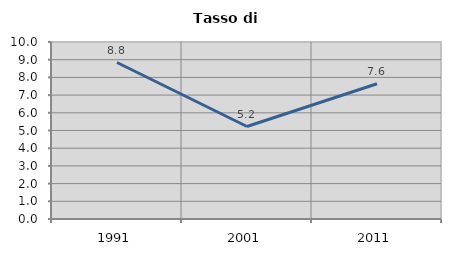
| Category | Tasso di disoccupazione   |
|---|---|
| 1991.0 | 8.84 |
| 2001.0 | 5.226 |
| 2011.0 | 7.641 |